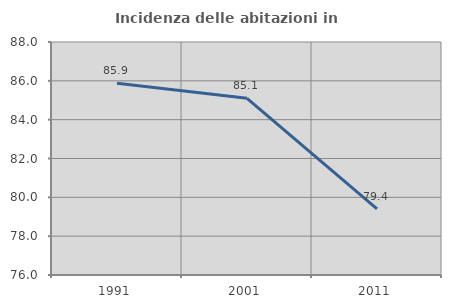
| Category | Incidenza delle abitazioni in proprietà  |
|---|---|
| 1991.0 | 85.877 |
| 2001.0 | 85.1 |
| 2011.0 | 79.409 |